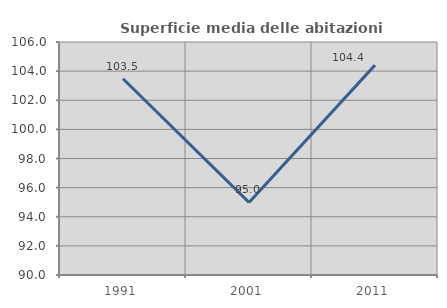
| Category | Superficie media delle abitazioni occupate |
|---|---|
| 1991.0 | 103.473 |
| 2001.0 | 94.982 |
| 2011.0 | 104.412 |